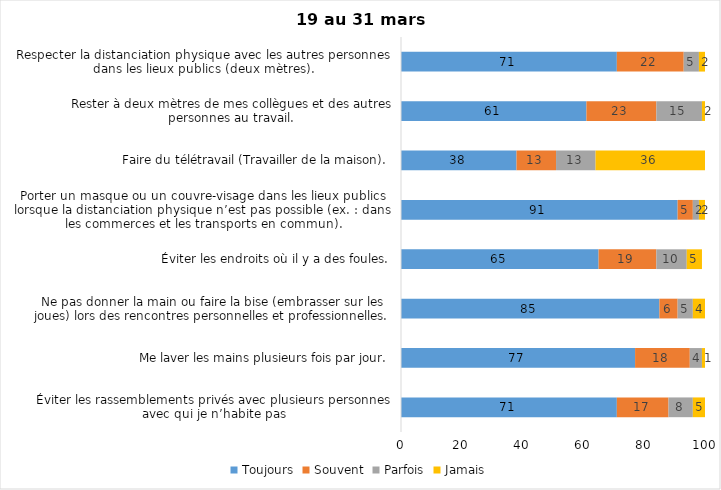
| Category | Toujours | Souvent | Parfois | Jamais |
|---|---|---|---|---|
| Éviter les rassemblements privés avec plusieurs personnes avec qui je n’habite pas | 71 | 17 | 8 | 5 |
| Me laver les mains plusieurs fois par jour. | 77 | 18 | 4 | 1 |
| Ne pas donner la main ou faire la bise (embrasser sur les joues) lors des rencontres personnelles et professionnelles. | 85 | 6 | 5 | 4 |
| Éviter les endroits où il y a des foules. | 65 | 19 | 10 | 5 |
| Porter un masque ou un couvre-visage dans les lieux publics lorsque la distanciation physique n’est pas possible (ex. : dans les commerces et les transports en commun). | 91 | 5 | 2 | 2 |
| Faire du télétravail (Travailler de la maison). | 38 | 13 | 13 | 36 |
| Rester à deux mètres de mes collègues et des autres personnes au travail. | 61 | 23 | 15 | 2 |
| Respecter la distanciation physique avec les autres personnes dans les lieux publics (deux mètres). | 71 | 22 | 5 | 2 |